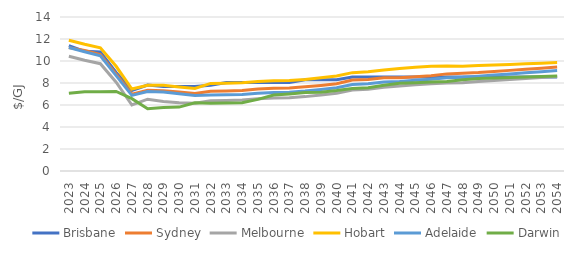
| Category | Brisbane | Sydney | Melbourne | Hobart | Adelaide | Darwin |
|---|---|---|---|---|---|---|
| 2023.0 | 11.391 | 11.214 | 10.43 | 11.881 | 11.226 | 7.075 |
| 2024.0 | 10.88 | 10.956 | 10.065 | 11.517 | 10.846 | 7.209 |
| 2025.0 | 10.824 | 10.581 | 9.752 | 11.203 | 10.471 | 7.206 |
| 2026.0 | 8.962 | 8.812 | 8.069 | 9.52 | 8.665 | 7.235 |
| 2027.0 | 7.326 | 6.984 | 5.997 | 7.449 | 6.873 | 6.574 |
| 2028.0 | 7.817 | 7.344 | 6.53 | 7.795 | 7.226 | 5.653 |
| 2029.0 | 7.685 | 7.295 | 6.32 | 7.788 | 7.187 | 5.783 |
| 2030.0 | 7.685 | 7.174 | 6.21 | 7.639 | 7.028 | 5.809 |
| 2031.0 | 7.685 | 7.047 | 6.16 | 7.499 | 6.861 | 6.205 |
| 2032.0 | 7.8 | 7.239 | 6.396 | 7.963 | 6.9 | 6.168 |
| 2033.0 | 8.05 | 7.282 | 6.419 | 7.985 | 6.923 | 6.179 |
| 2034.0 | 8.05 | 7.314 | 6.455 | 8.022 | 6.959 | 6.197 |
| 2035.0 | 8.05 | 7.453 | 6.562 | 8.129 | 7.067 | 6.513 |
| 2036.0 | 8.05 | 7.526 | 6.635 | 8.201 | 7.139 | 6.9 |
| 2037.0 | 8.05 | 7.549 | 6.654 | 8.22 | 7.158 | 7.001 |
| 2038.0 | 8.3 | 7.657 | 6.762 | 8.329 | 7.266 | 7.128 |
| 2039.0 | 8.3 | 7.781 | 6.904 | 8.471 | 7.408 | 7.169 |
| 2040.0 | 8.3 | 7.936 | 7.064 | 8.631 | 7.568 | 7.308 |
| 2041.0 | 8.553 | 8.27 | 7.361 | 8.941 | 7.862 | 7.495 |
| 2042.0 | 8.553 | 8.328 | 7.433 | 9.013 | 7.934 | 7.568 |
| 2043.0 | 8.553 | 8.479 | 7.606 | 9.185 | 8.1 | 7.79 |
| 2044.0 | 8.553 | 8.478 | 7.73 | 9.309 | 8.134 | 7.979 |
| 2045.0 | 8.553 | 8.573 | 7.843 | 9.423 | 8.248 | 8.03 |
| 2046.0 | 8.553 | 8.659 | 7.936 | 9.516 | 8.341 | 8.082 |
| 2047.0 | 8.553 | 8.829 | 8.01 | 9.541 | 8.483 | 8.145 |
| 2048.0 | 8.553 | 8.886 | 8.027 | 9.513 | 8.527 | 8.303 |
| 2049.0 | 8.553 | 8.951 | 8.144 | 9.582 | 8.621 | 8.414 |
| 2050.0 | 8.553 | 9.049 | 8.229 | 9.637 | 8.721 | 8.456 |
| 2051.0 | 8.553 | 9.148 | 8.316 | 9.693 | 8.823 | 8.498 |
| 2052.0 | 8.553 | 9.248 | 8.403 | 9.749 | 8.926 | 8.541 |
| 2053.0 | 8.553 | 9.348 | 8.491 | 9.806 | 9.03 | 8.583 |
| 2054.0 | 8.553 | 9.451 | 8.58 | 9.862 | 9.136 | 8.626 |